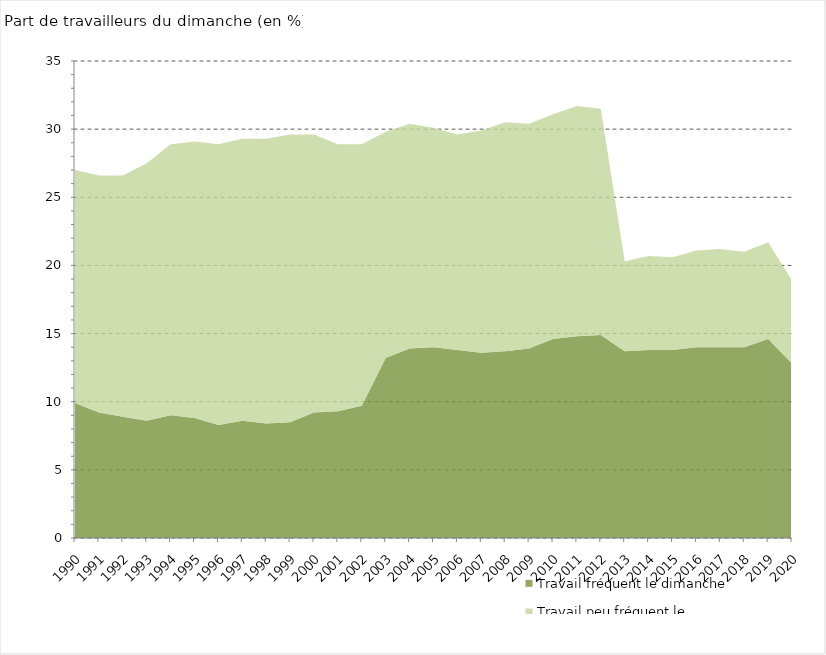
| Category | Travail fréquent le dimanche | Travail peu fréquent le dimanche |
|---|---|---|
| 1990 | 9.9 | 17.1 |
| 1991 | 9.2 | 17.4 |
| 1992 | 8.9 | 17.7 |
| 1993 | 8.6 | 18.9 |
| 1994 | 9 | 19.9 |
| 1995 | 8.8 | 20.3 |
| 1996 | 8.3 | 20.6 |
| 1997 | 8.6 | 20.7 |
| 1998 | 8.4 | 20.9 |
| 1999 | 8.5 | 21.1 |
| 2000 | 9.2 | 20.4 |
| 2001 | 9.3 | 19.6 |
| 2002 | 9.7 | 19.2 |
| 2003 | 13.2 | 16.6 |
| 2004 | 13.9 | 16.5 |
| 2005 | 14 | 16.1 |
| 2006 | 13.8 | 15.8 |
| 2007 | 13.6 | 16.3 |
| 2008 | 13.7 | 16.8 |
| 2009 | 13.9 | 16.5 |
| 2010 | 14.6 | 16.5 |
| 2011 | 14.8 | 16.9 |
| 2012 | 14.9 | 16.6 |
| 2013 | 13.7 | 6.6 |
| 2014 | 13.8 | 6.9 |
| 2015 | 13.8 | 6.8 |
| 2016 | 14 | 7.1 |
| 2017 | 14 | 7.2 |
| 2018 | 14 | 7 |
| 2019 | 14.6 | 7.1 |
| 2020 | 12.8 | 6.1 |